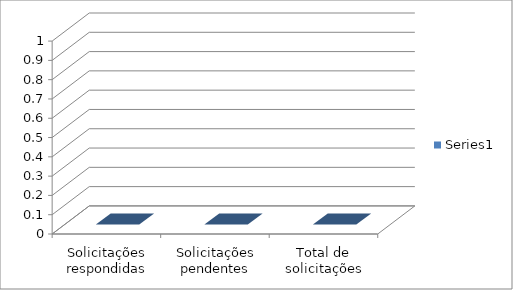
| Category | Series 0 |
|---|---|
| Solicitações respondidas | 0 |
| Solicitações pendentes | 0 |
| Total de solicitações | 0 |